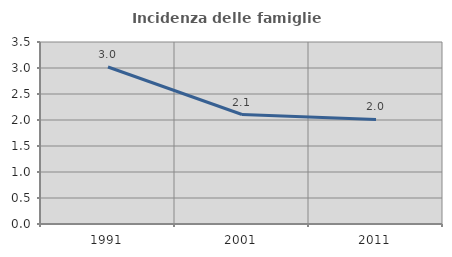
| Category | Incidenza delle famiglie numerose |
|---|---|
| 1991.0 | 3.019 |
| 2001.0 | 2.105 |
| 2011.0 | 2.011 |